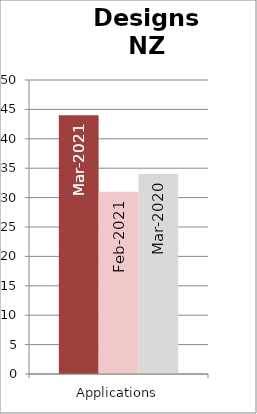
| Category | Mar-2021 | Feb-2021 | Mar-2020 |
|---|---|---|---|
| Applications | 44 | 31 | 34 |